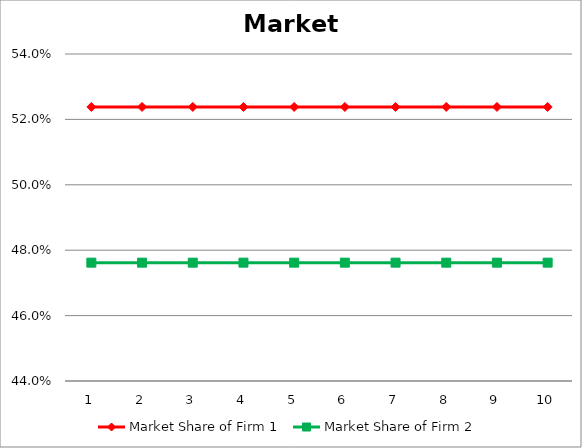
| Category | Market Share of Firm 1 | Market Share of Firm 2 |
|---|---|---|
| 0 | 0.524 | 0.476 |
| 1 | 0.524 | 0.476 |
| 2 | 0.524 | 0.476 |
| 3 | 0.524 | 0.476 |
| 4 | 0.524 | 0.476 |
| 5 | 0.524 | 0.476 |
| 6 | 0.524 | 0.476 |
| 7 | 0.524 | 0.476 |
| 8 | 0.524 | 0.476 |
| 9 | 0.524 | 0.476 |